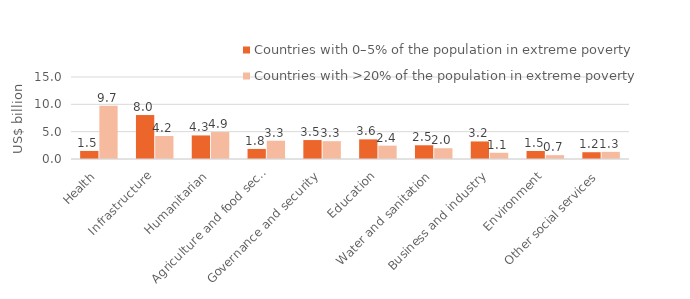
| Category | Countries with 0–5% of the population in extreme poverty | Countries with >20% of the population in extreme poverty |
|---|---|---|
| Health | 1.479 | 9.72 |
| Infrastructure | 8.043 | 4.205 |
| Humanitarian | 4.309 | 4.93 |
| Agriculture and food security | 1.841 | 3.338 |
| Governance and security | 3.466 | 3.26 |
| Education | 3.592 | 2.441 |
| Water and sanitation | 2.512 | 1.97 |
| Business and industry | 3.21 | 1.137 |
| Environment | 1.468 | 0.706 |
| Other social services | 1.24 | 1.302 |